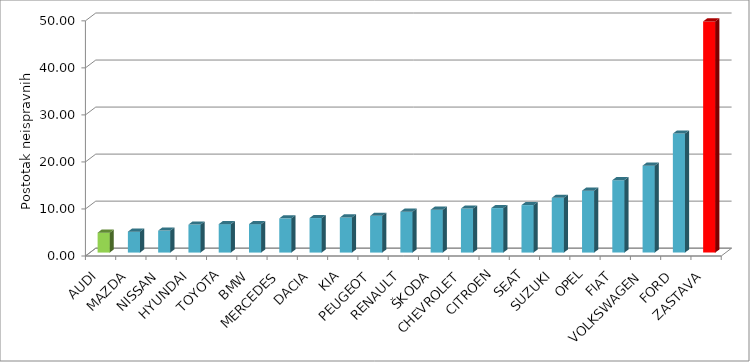
| Category | Series 4 |
|---|---|
| AUDI | 4.232 |
| MAZDA | 4.445 |
| NISSAN | 4.673 |
| HYUNDAI | 5.95 |
| TOYOTA | 6.043 |
| BMW | 6.045 |
| MERCEDES | 7.272 |
| DACIA | 7.335 |
| KIA | 7.454 |
| PEUGEOT | 7.805 |
| RENAULT | 8.685 |
| ŠKODA | 9.113 |
| CHEVROLET | 9.363 |
| CITROEN | 9.454 |
| SEAT | 10.091 |
| SUZUKI | 11.638 |
| OPEL | 13.159 |
| FIAT | 15.396 |
| VOLKSWAGEN | 18.484 |
| FORD | 25.306 |
| ZASTAVA | 49.146 |